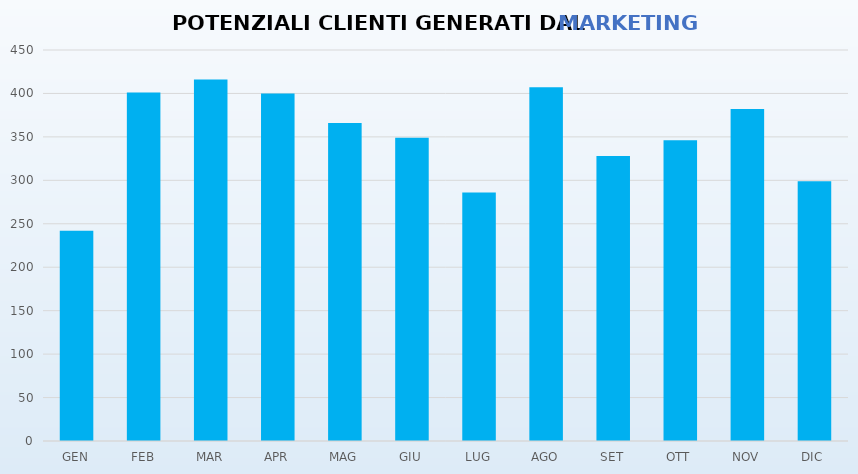
| Category | Series 0 |
|---|---|
| GEN | 242 |
| FEB | 401 |
| MAR | 416 |
| APR | 400 |
| MAG | 366 |
| GIU | 349 |
| LUG | 286 |
| AGO | 407 |
| SET | 328 |
| OTT | 346 |
| NOV | 382 |
| DIC | 299 |